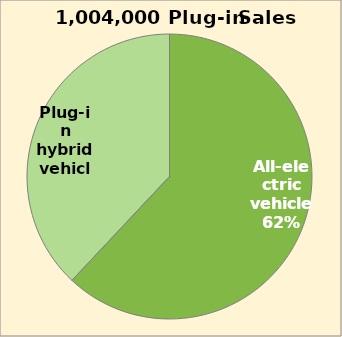
| Category | Series 0 |
|---|---|
| All-electric vehicle | 622480 |
| Plug-in hybrid vehicle | 381520 |